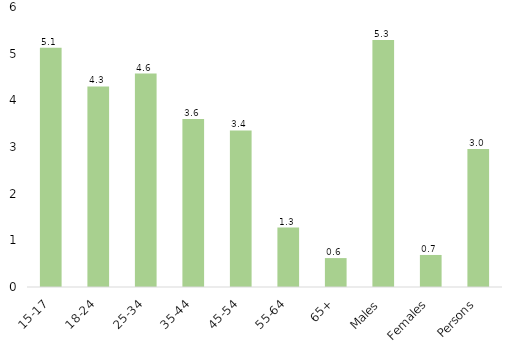
| Category | Series 0 |
|---|---|
|  15-17 | 5.128 |
|  18-24 | 4.299 |
|  25-34 | 4.573 |
|  35-44 | 3.6 |
|  45-54 | 3.355 |
|  55-64 | 1.272 |
|  65+ | 0.619 |
| Males | 5.294 |
| Females | 0.687 |
| Persons | 2.959 |